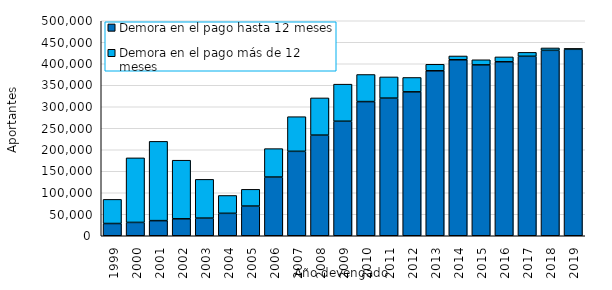
| Category | Demora en el pago hasta 12 meses | Demora en el pago más de 12 meses |
|---|---|---|
| 1999.0 | 28465 | 56142 |
| 2000.0 | 31003 | 150138 |
| 2001.0 | 35168 | 184372 |
| 2002.0 | 39441 | 136258 |
| 2003.0 | 40989 | 90177 |
| 2004.0 | 52174 | 41516 |
| 2005.0 | 69016 | 38972 |
| 2006.0 | 136501 | 66131 |
| 2007.0 | 196361 | 80546 |
| 2008.0 | 234033 | 86515 |
| 2009.0 | 266322 | 86229 |
| 2010.0 | 311997 | 63028 |
| 2011.0 | 320064 | 49322 |
| 2012.0 | 334657 | 33463 |
| 2013.0 | 383649 | 15144 |
| 2014.0 | 409267 | 8797 |
| 2015.0 | 397387 | 11876 |
| 2016.0 | 404689 | 11250 |
| 2017.0 | 417386 | 9127 |
| 2018.0 | 431215 | 5545 |
| 2019.0 | 433647 | 1947 |